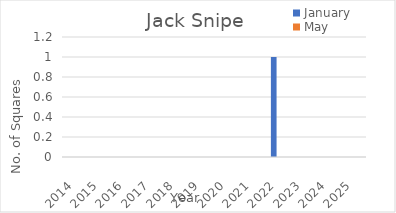
| Category | January | May |
|---|---|---|
| 2014.0 | 0 | 0 |
| 2015.0 | 0 | 0 |
| 2016.0 | 0 | 0 |
| 2017.0 | 0 | 0 |
| 2018.0 | 0 | 0 |
| 2019.0 | 0 | 0 |
| 2020.0 | 0 | 0 |
| 2021.0 | 0 | 0 |
| 2022.0 | 1 | 0 |
| 2023.0 | 0 | 0 |
| 2024.0 | 0 | 0 |
| 2025.0 | 0 | 0 |